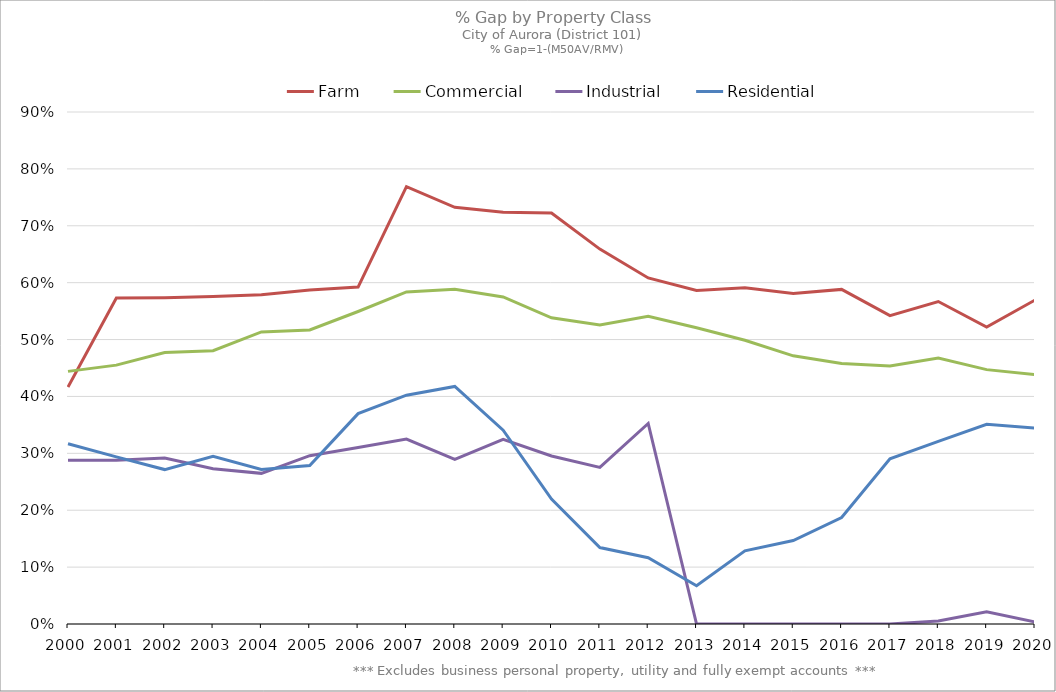
| Category | Farm | Commercial | Industrial | Residential |
|---|---|---|---|---|
| 2000.0 | 0.417 | 0.444 | 0.288 | 0.317 |
| 2001.0 | 0.573 | 0.455 | 0.288 | 0.294 |
| 2002.0 | 0.574 | 0.477 | 0.292 | 0.271 |
| 2003.0 | 0.576 | 0.48 | 0.273 | 0.295 |
| 2004.0 | 0.579 | 0.513 | 0.265 | 0.272 |
| 2005.0 | 0.587 | 0.517 | 0.296 | 0.279 |
| 2006.0 | 0.592 | 0.549 | 0.31 | 0.37 |
| 2007.0 | 0.769 | 0.584 | 0.325 | 0.402 |
| 2008.0 | 0.732 | 0.588 | 0.29 | 0.418 |
| 2009.0 | 0.724 | 0.575 | 0.325 | 0.341 |
| 2010.0 | 0.722 | 0.538 | 0.295 | 0.22 |
| 2011.0 | 0.659 | 0.526 | 0.275 | 0.134 |
| 2012.0 | 0.608 | 0.541 | 0.353 | 0.117 |
| 2013.0 | 0.586 | 0.521 | 0 | 0.067 |
| 2014.0 | 0.591 | 0.499 | 0 | 0.129 |
| 2015.0 | 0.581 | 0.471 | 0 | 0.147 |
| 2016.0 | 0.588 | 0.458 | 0 | 0.187 |
| 2017.0 | 0.542 | 0.454 | 0 | 0.29 |
| 2018.0 | 0.567 | 0.467 | 0.005 | 0.321 |
| 2019.0 | 0.522 | 0.447 | 0.021 | 0.351 |
| 2020.0 | 0.569 | 0.438 | 0.003 | 0.344 |